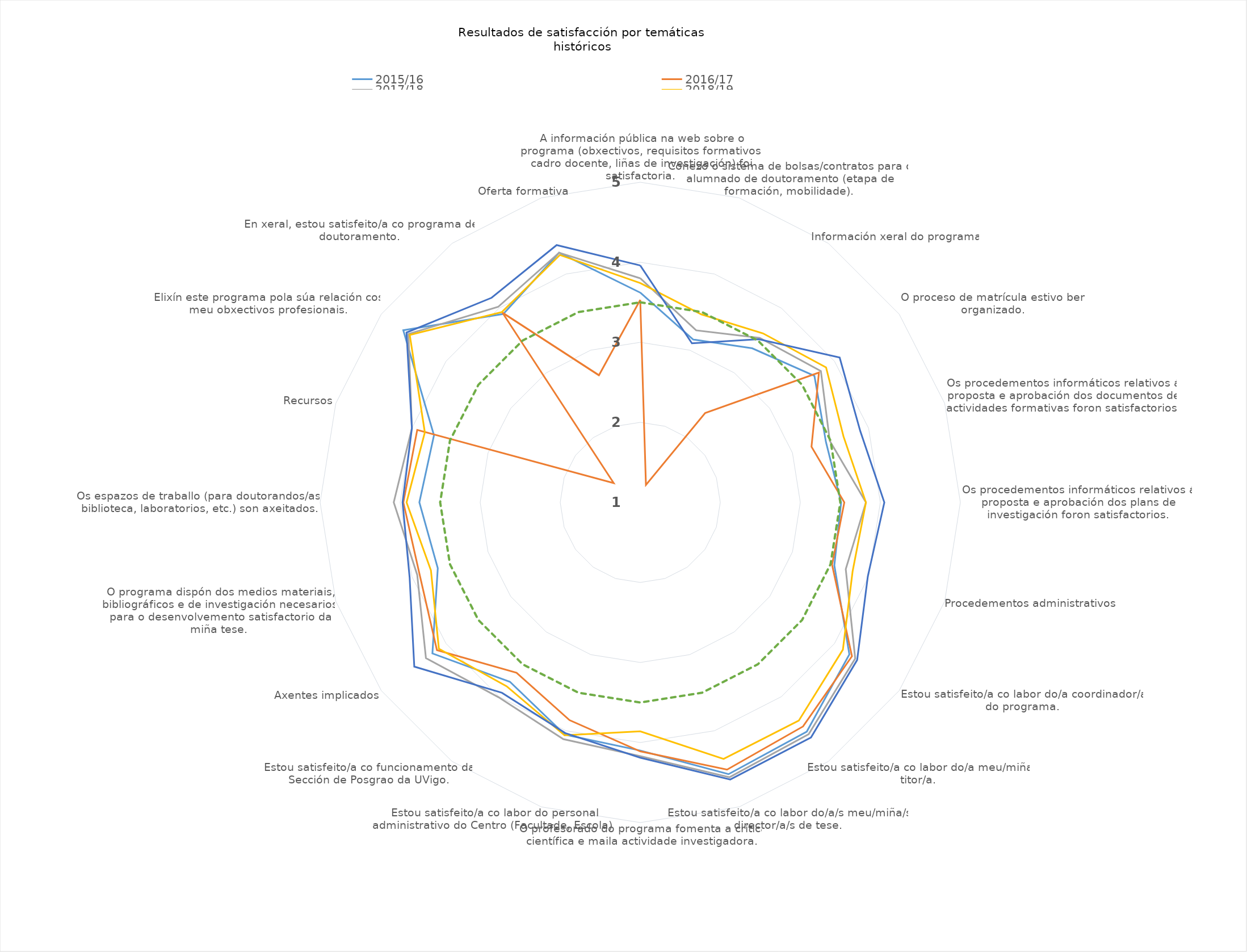
| Category | 2015/16 | 2016/17 | 2017/18 | 2018/19 | 2019/20 | Obxectivo de Calidade 2019/20 |
|---|---|---|---|---|---|---|
| A información pública na web sobre o programa (obxectivos, requisitos formativos, cadro docente, liñas de investigación) foi satisfactoria. | 3.621 | 3.53 | 3.8 | 3.74 | 3.96 | 3.5 |
| Coñezo o sistema de bolsas/contratos para o alumnado de doutoramento (etapa de formación, mobilidade). | 3.14 | 1.23 | 3.26 | 3.47 | 3.09 | 3.5 |
| Información xeral do programa | 3.38 | 2.38 | 3.54 | 3.61 | 3.52 | 3.5 |
| O proceso de matrícula estivo ben organizado. | 3.69 | 3.76 | 3.79 | 3.87 | 4.08 | 3.5 |
| Os procedementos informáticos relativos á proposta e aprobación dos documentos de actividades formativas foron satisfactorios. | 3.44 | 3.25 | 3.49 | 3.67 | 3.89 | 3.5 |
| Os procedementos informáticos relativos á proposta e aprobación dos plans de investigación foron satisfactorios. | 3.51 | 3.55 | 3.82 | 3.82 | 4.05 | 3.5 |
| Procedementos administrativos | 3.55 | 3.52 | 3.7 | 3.79 | 3.99 | 3.5 |
| Estou satisfeito/a co labor do/a coordinador/a do programa. | 4.23 | 4.27 | 4.32 | 4.13 | 4.35 | 3.5 |
| Estou satisfeito/a co labor do/a meu/miña titor/a. | 4.54 | 4.46 | 4.58 | 4.37 | 4.63 | 3.5 |
| Estou satisfeito/a co labor do/a/s meu/miña/s director/a/s de tese. | 4.57 | 4.51 | 4.61 | 4.37 | 4.64 | 3.5 |
| O profesorado do programa fomenta a crítica científica e maila actividade investigadora. | 4.1 | 4.11 | 4.17 | 3.86 | 4.19 | 3.5 |
| Estou satisfeito/a co labor do personal administrativo do Centro (Facultade, Escola). | 4.05 | 3.86 | 4.11 | 4.06 | 4.03 | 3.5 |
| Estou satisfeito/a co funcionamento da Sección de Posgrao da UVigo. | 3.77 | 3.63 | 4.01 | 3.84 | 3.94 | 3.5 |
| Axentes implicados | 4.21 | 4.14 | 4.31 | 4.11 | 4.49 | 3.5 |
| O programa dispón dos medios materiais, bibliográficos e de investigación necesarios para o desenvolvemento satisfactorio da miña tese. | 3.66 | 3.9 | 3.93 | 3.75 | 4.03 | 3.5 |
| Os espazos de traballo (para doutorandos/as, biblioteca, laboratorios, etc.) son axeitados. | 3.76 | 3.96 | 4.08 | 3.92 | 3.97 | 3.5 |
| Recursos | 3.71 | 3.93 | 4 | 3.83 | 4 | 3.5 |
| Elixín este programa pola súa relación cos meu obxectivos profesionais. | 4.66 | 1.41 | 4.58 | 4.56 | 4.61 | 3.5 |
| En xeral, estou satisfeito/a co programa de doutoramento. | 3.91 | 3.93 | 4.02 | 3.94 | 4.16 | 3.5 |
|  Oferta formativa | 4.28 | 2.67 | 4.28 | 4.25 | 4.38 | 3.5 |